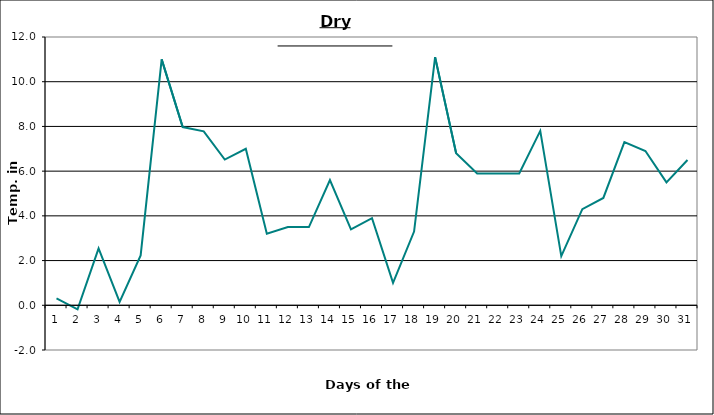
| Category | Series 0 |
|---|---|
| 0 | 0.31 |
| 1 | -0.18 |
| 2 | 2.54 |
| 3 | 0.15 |
| 4 | 2.23 |
| 5 | 11 |
| 6 | 7.97 |
| 7 | 7.78 |
| 8 | 6.52 |
| 9 | 7 |
| 10 | 3.2 |
| 11 | 3.5 |
| 12 | 3.5 |
| 13 | 5.6 |
| 14 | 3.4 |
| 15 | 3.9 |
| 16 | 1 |
| 17 | 3.3 |
| 18 | 11.1 |
| 19 | 6.8 |
| 20 | 5.9 |
| 21 | 5.9 |
| 22 | 5.9 |
| 23 | 7.8 |
| 24 | 2.2 |
| 25 | 4.3 |
| 26 | 4.8 |
| 27 | 7.3 |
| 28 | 6.9 |
| 29 | 5.5 |
| 30 | 6.5 |